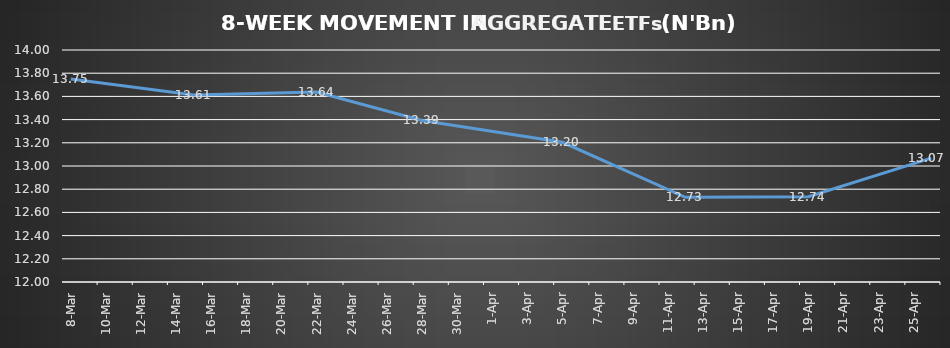
| Category | ETFs AGGREGATE |
|---|---|
| 2024-03-08 | 13.75 |
| 2024-03-15 | 13.612 |
| 2024-03-22 | 13.638 |
| 2024-03-28 | 13.392 |
| 2024-04-05 | 13.205 |
| 2024-04-12 | 12.73 |
| 2024-04-19 | 12.735 |
| 2024-04-26 | 13.068 |